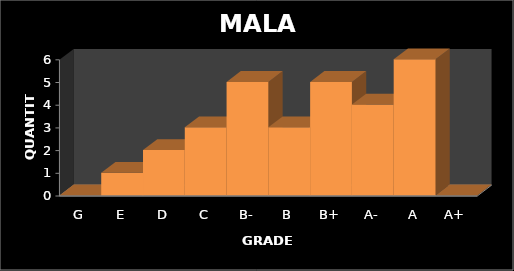
| Category | QUANTITY |
|---|---|
| G | 0 |
| E | 1 |
| D | 2 |
| C | 3 |
| B- | 5 |
| B | 3 |
| B+ | 5 |
| A- | 4 |
| A | 6 |
| A+ | 0 |